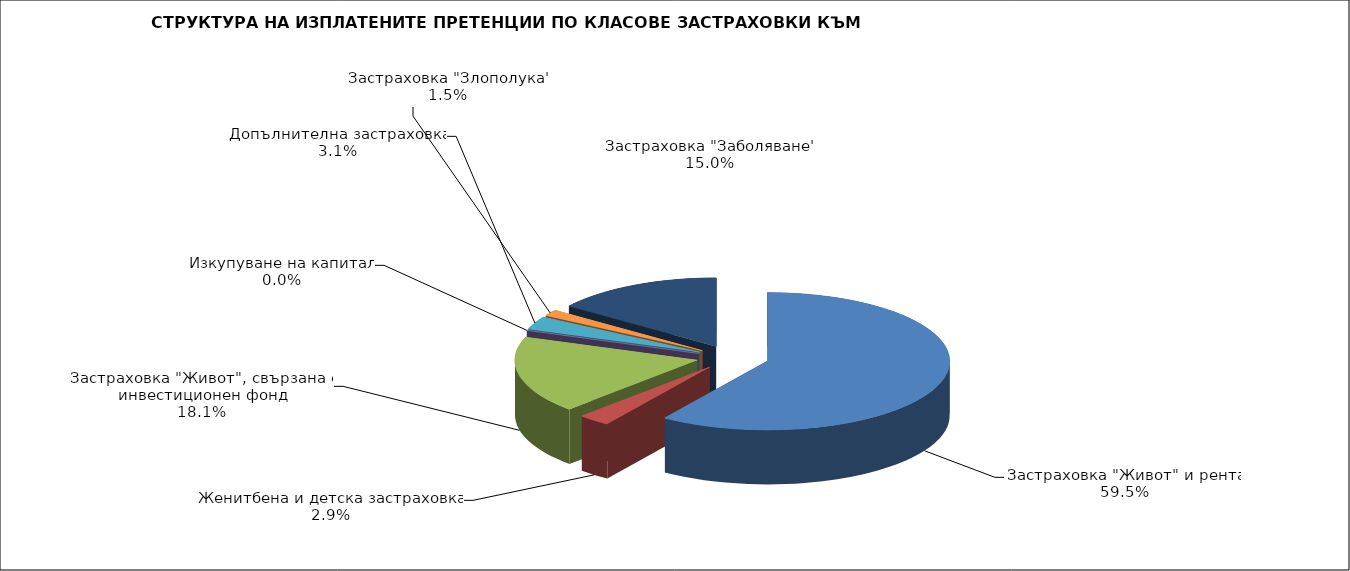
| Category | 19 396 558 |
|---|---|
| Застраховка "Живот" и рента | 19396557.917 |
| Женитбена и детска застраховка | 936139.592 |
| Застраховка "Живот", свързана с инвестиционен фонд | 5903937.137 |
| Изкупуване на капитал | 0 |
| Допълнителна застраховка | 1003553.396 |
| Застраховка "Злополука" | 484160.721 |
| Застраховка "Заболяване" | 4880699.689 |